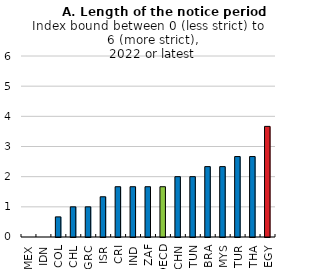
| Category | Series 0 |
|---|---|
| MEX | 0 |
| IDN | 0 |
| COL | 0.667 |
| CHL | 1 |
| GRC | 1 |
| ISR | 1.333 |
| CRI | 1.667 |
| IND | 1.667 |
| ZAF | 1.667 |
| OECD | 1.667 |
| CHN | 2 |
| TUN | 2 |
| BRA | 2.333 |
| MYS | 2.333 |
| TUR | 2.667 |
| THA | 2.667 |
| EGY | 3.667 |